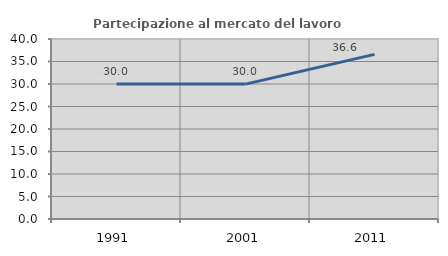
| Category | Partecipazione al mercato del lavoro  femminile |
|---|---|
| 1991.0 | 30.018 |
| 2001.0 | 29.975 |
| 2011.0 | 36.577 |